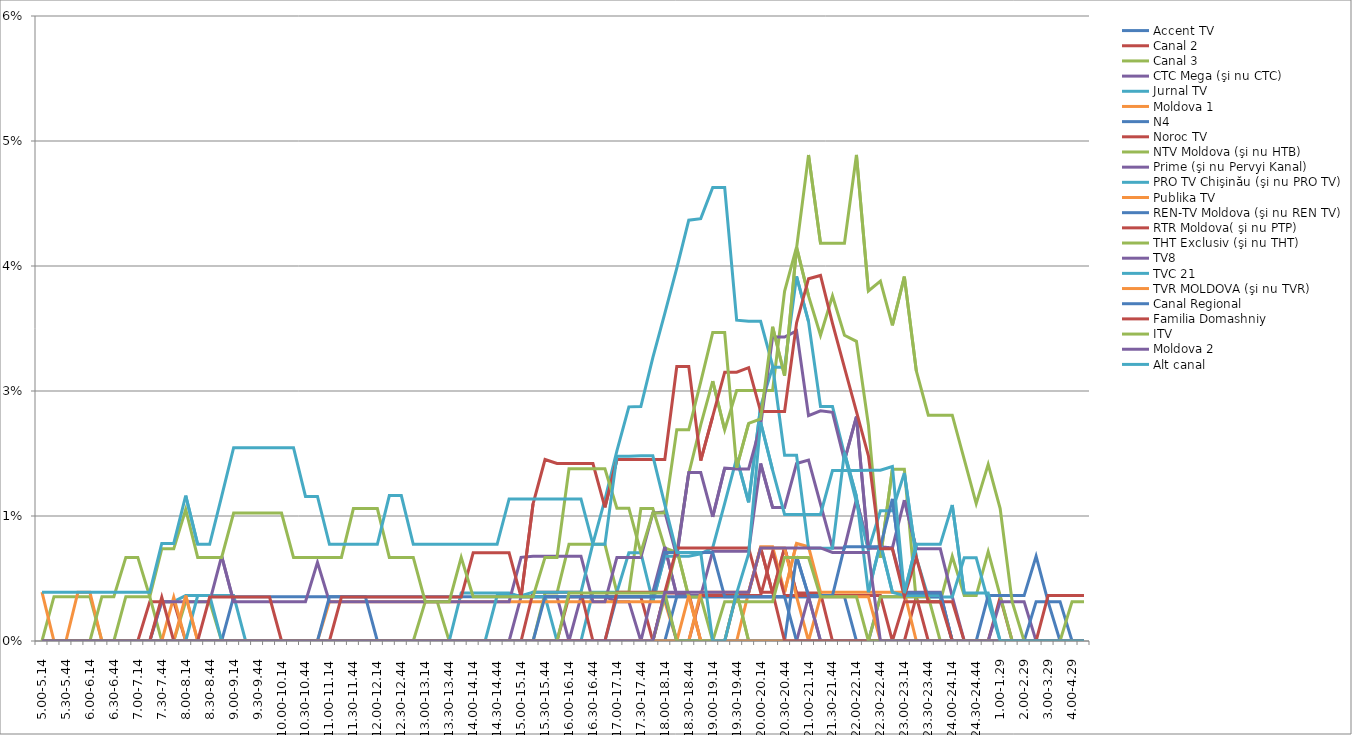
| Category | Accent TV | Canal 2 | Canal 3 | CTC Mega (şi nu CTC) | Jurnal TV | Moldova 1 | N4 | Noroc TV | NTV Moldova (şi nu HTB) | Prime (şi nu Pervyi Kanal) | PRO TV Chişinău (şi nu PRO TV) | Publika TV  | REN-TV Moldova (şi nu REN TV)  | RTR Moldova( şi nu PTP)  | THT Exclusiv (şi nu THT) | TV8 | TVC 21 | TVR MOLDOVA (şi nu TVR) | Canal Regional | Familia Domashniy | ITV | Moldova 2 | Alt canal |
|---|---|---|---|---|---|---|---|---|---|---|---|---|---|---|---|---|---|---|---|---|---|---|---|
| 5.00-5.14 | 0 | 0 | 0 | 0 | 0 | 0 | 0 | 0 | 0 | 0 | 0 | 0.005 | 0 | 0 | 0 | 0 | 0 | 0 | 0 | 0 | 0 | 0 | 0.005 |
| 5.15-5.29 | 0 | 0 | 0.004 | 0 | 0 | 0 | 0 | 0 | 0 | 0 | 0 | 0 | 0 | 0 | 0 | 0 | 0 | 0 | 0 | 0 | 0 | 0 | 0.005 |
| 5.30-5.44 | 0 | 0 | 0.004 | 0 | 0 | 0 | 0 | 0 | 0 | 0 | 0 | 0 | 0 | 0 | 0 | 0 | 0 | 0 | 0 | 0 | 0 | 0 | 0.005 |
| 5.45-5.59 | 0 | 0 | 0.004 | 0 | 0 | 0 | 0 | 0 | 0 | 0 | 0 | 0.005 | 0 | 0 | 0 | 0 | 0 | 0 | 0 | 0 | 0 | 0 | 0.005 |
| 6.00-6.14 | 0 | 0 | 0.004 | 0 | 0 | 0 | 0 | 0 | 0 | 0 | 0 | 0.005 | 0 | 0 | 0 | 0 | 0 | 0 | 0 | 0 | 0 | 0 | 0.005 |
| 6.15-6.29 | 0 | 0 | 0 | 0 | 0 | 0 | 0 | 0 | 0 | 0 | 0 | 0 | 0 | 0 | 0.004 | 0 | 0 | 0 | 0 | 0 | 0 | 0 | 0.005 |
| 6.30-6.44 | 0 | 0 | 0 | 0 | 0 | 0 | 0 | 0 | 0 | 0 | 0 | 0 | 0 | 0 | 0.004 | 0 | 0 | 0 | 0 | 0 | 0 | 0 | 0.005 |
| 6.45-6.59 | 0 | 0 | 0.004 | 0 | 0 | 0 | 0 | 0 | 0 | 0 | 0 | 0 | 0 | 0 | 0.008 | 0 | 0 | 0 | 0 | 0 | 0 | 0 | 0.005 |
| 7.00-7.14 | 0 | 0 | 0.004 | 0 | 0 | 0 | 0 | 0 | 0 | 0 | 0 | 0 | 0 | 0 | 0.008 | 0 | 0 | 0 | 0 | 0 | 0 | 0 | 0.005 |
| 7.15-7.29 | 0 | 0.004 | 0.004 | 0 | 0 | 0 | 0 | 0 | 0 | 0 | 0 | 0 | 0 | 0 | 0.004 | 0 | 0 | 0 | 0 | 0 | 0 | 0 | 0.005 |
| 7.30-7.44 | 0 | 0.004 | 0 | 0 | 0.004 | 0 | 0 | 0 | 0 | 0.004 | 0 | 0 | 0 | 0.004 | 0.009 | 0 | 0 | 0 | 0 | 0 | 0 | 0 | 0.01 |
| 7.45-7.59 | 0 | 0.004 | 0 | 0 | 0.004 | 0.004 | 0 | 0 | 0 | 0.004 | 0 | 0 | 0 | 0 | 0.009 | 0 | 0 | 0 | 0 | 0 | 0 | 0 | 0.01 |
| 8.00-8.14 | 0 | 0 | 0.004 | 0 | 0.005 | 0 | 0 | 0 | 0 | 0.004 | 0 | 0.005 | 0 | 0 | 0.013 | 0 | 0 | 0 | 0 | 0 | 0 | 0 | 0.015 |
| 8.15-8.29 | 0 | 0 | 0.004 | 0 | 0.005 | 0 | 0 | 0 | 0 | 0.004 | 0.005 | 0 | 0 | 0 | 0.008 | 0 | 0 | 0 | 0 | 0 | 0 | 0 | 0.01 |
| 8.30-8.44 | 0 | 0 | 0.004 | 0 | 0.005 | 0 | 0 | 0 | 0 | 0.004 | 0.005 | 0 | 0 | 0.004 | 0.008 | 0 | 0 | 0 | 0 | 0 | 0 | 0 | 0.01 |
| 8.45-8.59 | 0 | 0 | 0 | 0 | 0.005 | 0 | 0 | 0 | 0 | 0.008 | 0 | 0 | 0 | 0.004 | 0.008 | 0 | 0 | 0 | 0 | 0 | 0 | 0 | 0.014 |
| 9.00-9.14 | 0.004 | 0 | 0 | 0 | 0.005 | 0 | 0 | 0 | 0 | 0.004 | 0 | 0 | 0 | 0.004 | 0.013 | 0 | 0 | 0 | 0 | 0 | 0 | 0 | 0.019 |
| 9.15-9.29 | 0.004 | 0 | 0 | 0 | 0 | 0 | 0 | 0 | 0 | 0.004 | 0 | 0 | 0 | 0.004 | 0.013 | 0 | 0 | 0 | 0 | 0 | 0 | 0 | 0.019 |
| 9.30-9.44 | 0.004 | 0 | 0 | 0 | 0 | 0 | 0 | 0 | 0 | 0.004 | 0 | 0 | 0 | 0.004 | 0.013 | 0 | 0 | 0 | 0 | 0 | 0 | 0 | 0.019 |
| 9.45-9.59 | 0.004 | 0 | 0 | 0 | 0 | 0 | 0 | 0 | 0 | 0.004 | 0 | 0 | 0 | 0.004 | 0.013 | 0 | 0 | 0 | 0 | 0 | 0 | 0 | 0.019 |
| 10.00-10.14 | 0.004 | 0 | 0 | 0 | 0 | 0 | 0 | 0 | 0 | 0.004 | 0 | 0 | 0 | 0 | 0.013 | 0 | 0 | 0 | 0 | 0 | 0 | 0 | 0.019 |
| 10.15-10.29 | 0.004 | 0 | 0 | 0 | 0 | 0 | 0 | 0 | 0 | 0.004 | 0 | 0 | 0 | 0 | 0.008 | 0 | 0 | 0 | 0 | 0 | 0 | 0 | 0.019 |
| 10.30-10.44 | 0.004 | 0 | 0 | 0 | 0 | 0 | 0 | 0 | 0 | 0.004 | 0 | 0 | 0 | 0 | 0.008 | 0 | 0 | 0 | 0 | 0 | 0 | 0 | 0.014 |
| 10.45-10.59 | 0.004 | 0 | 0 | 0 | 0 | 0 | 0 | 0 | 0 | 0.008 | 0 | 0 | 0 | 0 | 0.008 | 0 | 0 | 0 | 0 | 0 | 0 | 0 | 0.014 |
| 11.00-11.14 | 0.004 | 0 | 0 | 0 | 0 | 0.004 | 0 | 0 | 0 | 0.004 | 0 | 0 | 0.004 | 0 | 0.008 | 0 | 0 | 0 | 0 | 0 | 0 | 0 | 0.01 |
| 11.15-11.29 | 0.004 | 0 | 0 | 0 | 0 | 0.004 | 0 | 0 | 0 | 0.004 | 0 | 0 | 0.004 | 0.004 | 0.008 | 0 | 0 | 0 | 0 | 0 | 0 | 0 | 0.01 |
| 11.30-11.44 | 0.004 | 0 | 0 | 0 | 0 | 0.004 | 0 | 0 | 0 | 0.004 | 0 | 0 | 0.004 | 0.004 | 0.013 | 0 | 0 | 0 | 0 | 0 | 0 | 0 | 0.01 |
| 11.45-11.59 | 0.004 | 0 | 0 | 0 | 0 | 0.004 | 0 | 0 | 0 | 0.004 | 0 | 0 | 0.004 | 0.004 | 0.013 | 0 | 0 | 0 | 0 | 0 | 0 | 0 | 0.01 |
| 12.00-12.14 | 0.004 | 0 | 0 | 0 | 0 | 0.004 | 0 | 0 | 0 | 0.004 | 0 | 0 | 0 | 0.004 | 0.013 | 0 | 0 | 0 | 0 | 0 | 0 | 0 | 0.01 |
| 12.15-12.29 | 0.004 | 0 | 0 | 0 | 0 | 0.004 | 0 | 0 | 0 | 0.004 | 0 | 0 | 0 | 0.004 | 0.008 | 0 | 0 | 0 | 0 | 0 | 0 | 0 | 0.015 |
| 12.30-12.44 | 0.004 | 0 | 0 | 0 | 0 | 0.004 | 0 | 0 | 0 | 0.004 | 0 | 0 | 0 | 0.004 | 0.008 | 0 | 0 | 0 | 0 | 0 | 0 | 0 | 0.015 |
| 12.45-12.59 | 0.004 | 0 | 0 | 0 | 0 | 0.004 | 0 | 0 | 0 | 0.004 | 0 | 0 | 0 | 0.004 | 0.008 | 0 | 0 | 0 | 0 | 0 | 0 | 0 | 0.01 |
| 13.00-13.14 | 0.004 | 0 | 0.004 | 0 | 0 | 0.004 | 0 | 0 | 0 | 0.004 | 0 | 0 | 0 | 0.004 | 0.004 | 0 | 0 | 0 | 0 | 0 | 0 | 0 | 0.01 |
| 13.15-13.29 | 0.004 | 0 | 0.004 | 0 | 0 | 0.004 | 0 | 0 | 0 | 0.004 | 0 | 0 | 0 | 0.004 | 0.004 | 0 | 0 | 0 | 0 | 0 | 0 | 0 | 0.01 |
| 13.30-13.44 | 0.004 | 0 | 0 | 0 | 0 | 0.004 | 0 | 0 | 0 | 0.004 | 0 | 0 | 0 | 0.004 | 0.004 | 0 | 0 | 0 | 0 | 0 | 0 | 0 | 0.01 |
| 13.45-13.59 | 0.004 | 0 | 0 | 0 | 0.005 | 0.004 | 0 | 0 | 0 | 0.004 | 0 | 0 | 0 | 0.004 | 0.008 | 0 | 0 | 0 | 0 | 0 | 0 | 0 | 0.01 |
| 14.00-14.14 | 0.004 | 0 | 0 | 0 | 0.005 | 0.004 | 0 | 0 | 0 | 0.004 | 0 | 0 | 0 | 0.009 | 0.004 | 0 | 0 | 0 | 0 | 0 | 0 | 0 | 0.01 |
| 14.15-14.29 | 0.004 | 0 | 0 | 0 | 0.005 | 0.004 | 0 | 0 | 0 | 0.004 | 0 | 0 | 0 | 0.009 | 0.004 | 0 | 0 | 0 | 0 | 0 | 0 | 0 | 0.01 |
| 14.30-14.44 | 0.004 | 0 | 0 | 0 | 0.005 | 0.004 | 0 | 0 | 0 | 0.004 | 0.005 | 0 | 0 | 0.009 | 0.004 | 0 | 0 | 0 | 0 | 0 | 0 | 0 | 0.01 |
| 14.45-14.59 | 0.004 | 0 | 0 | 0 | 0.005 | 0.004 | 0 | 0 | 0 | 0.004 | 0.005 | 0 | 0 | 0.009 | 0.004 | 0 | 0 | 0 | 0 | 0 | 0 | 0 | 0.014 |
| 15.00-15.14 | 0.004 | 0 | 0 | 0.004 | 0.004 | 0.004 | 0 | 0 | 0 | 0.008 | 0.005 | 0 | 0 | 0.004 | 0.004 | 0 | 0 | 0 | 0 | 0 | 0 | 0 | 0.014 |
| 15.15-15.29 | 0.004 | 0 | 0 | 0.004 | 0.004 | 0.004 | 0 | 0.005 | 0 | 0.008 | 0.005 | 0 | 0 | 0.014 | 0.004 | 0 | 0 | 0 | 0 | 0 | 0 | 0 | 0.014 |
| 15.30-15.44 | 0.004 | 0 | 0.005 | 0.004 | 0.004 | 0.004 | 0 | 0.005 | 0 | 0.008 | 0.005 | 0 | 0 | 0.018 | 0.008 | 0 | 0 | 0 | 0.004 | 0 | 0 | 0 | 0.014 |
| 15.45-15.59 | 0.004 | 0 | 0.005 | 0.004 | 0 | 0.004 | 0 | 0.005 | 0 | 0.008 | 0.005 | 0 | 0 | 0.018 | 0.008 | 0 | 0 | 0 | 0.004 | 0 | 0 | 0 | 0.014 |
| 16.00-16.14 | 0.004 | 0.004 | 0.01 | 0 | 0 | 0.004 | 0 | 0.005 | 0 | 0.008 | 0.005 | 0 | 0 | 0.018 | 0.017 | 0 | 0 | 0 | 0.004 | 0 | 0.005 | 0 | 0.014 |
| 16.15-16.29 | 0.004 | 0.004 | 0.01 | 0.004 | 0 | 0.004 | 0 | 0.005 | 0 | 0.008 | 0.005 | 0 | 0 | 0.018 | 0.017 | 0 | 0 | 0 | 0.004 | 0 | 0.005 | 0 | 0.014 |
| 16.30-16.44 | 0.004 | 0.004 | 0.01 | 0.004 | 0.005 | 0.004 | 0 | 0 | 0 | 0.004 | 0.01 | 0 | 0 | 0.018 | 0.017 | 0 | 0 | 0 | 0.004 | 0 | 0.005 | 0 | 0.01 |
| 16.45-16.59 | 0.004 | 0.004 | 0.01 | 0.004 | 0.005 | 0.004 | 0 | 0 | 0 | 0.004 | 0.014 | 0 | 0 | 0.013 | 0.017 | 0 | 0 | 0 | 0.004 | 0 | 0.005 | 0 | 0.01 |
| 17.00-17.14 | 0.004 | 0.004 | 0.005 | 0.004 | 0.005 | 0.004 | 0 | 0 | 0 | 0.008 | 0.019 | 0 | 0.004 | 0.018 | 0.013 | 0 | 0 | 0 | 0.004 | 0.005 | 0.005 | 0 | 0.018 |
| 17.15-17.29 | 0.004 | 0.004 | 0.005 | 0.004 | 0.009 | 0.004 | 0 | 0 | 0 | 0.008 | 0.023 | 0 | 0.004 | 0.018 | 0.013 | 0 | 0 | 0 | 0.004 | 0.005 | 0.005 | 0 | 0.018 |
| 17.30-17.44 | 0.004 | 0.004 | 0.013 | 0 | 0.009 | 0.004 | 0 | 0 | 0 | 0.008 | 0.023 | 0 | 0.004 | 0.018 | 0.009 | 0 | 0 | 0 | 0.004 | 0.005 | 0.005 | 0 | 0.019 |
| 17.45-17.59 | 0.004 | 0 | 0.013 | 0.005 | 0.004 | 0.004 | 0 | 0 | 0 | 0.013 | 0.028 | 0 | 0.004 | 0.018 | 0.013 | 0 | 0 | 0 | 0.004 | 0.005 | 0.005 | 0 | 0.019 |
| 18.00-18.14 | 0.004 | 0.005 | 0.009 | 0.009 | 0.008 | 0.004 | 0 | 0 | 0.004 | 0.013 | 0.033 | 0 | 0.004 | 0.018 | 0.013 | 0 | 0 | 0 | 0.009 | 0.005 | 0.005 | 0.005 | 0.014 |
| 18.15-18.29 | 0.004 | 0.005 | 0.009 | 0.005 | 0.008 | 0 | 0.004 | 0 | 0.009 | 0.008 | 0.037 | 0 | 0 | 0.027 | 0.021 | 0 | 0 | 0 | 0.009 | 0.009 | 0 | 0.005 | 0.009 |
| 18.30-18.44 | 0.004 | 0.005 | 0.017 | 0.005 | 0.008 | 0 | 0.004 | 0 | 0.004 | 0.017 | 0.042 | 0 | 0 | 0.027 | 0.021 | 0 | 0 | 0.005 | 0.009 | 0.009 | 0 | 0.005 | 0.009 |
| 18.45-18.59 | 0.004 | 0 | 0.022 | 0.005 | 0.009 | 0 | 0.004 | 0.005 | 0.004 | 0.017 | 0.042 | 0.005 | 0 | 0.018 | 0.026 | 0 | 0 | 0 | 0.009 | 0.009 | 0 | 0.005 | 0.009 |
| 19.00-19.14 | 0.004 | 0 | 0.026 | 0.009 | 0.009 | 0 | 0.004 | 0.005 | 0 | 0.012 | 0.045 | 0.005 | 0 | 0.022 | 0.031 | 0 | 0 | 0 | 0.009 | 0.009 | 0 | 0.005 | 0 |
| 19.15-19.29 | 0.004 | 0 | 0.021 | 0.009 | 0.014 | 0 | 0.004 | 0.005 | 0 | 0.017 | 0.045 | 0.005 | 0 | 0.027 | 0.031 | 0 | 0 | 0 | 0.004 | 0.009 | 0.004 | 0.005 | 0 |
| 19.30-19.44 | 0.004 | 0.005 | 0.025 | 0.009 | 0.018 | 0 | 0.004 | 0.005 | 0.005 | 0.017 | 0.032 | 0.005 | 0 | 0.027 | 0.017 | 0 | 0 | 0 | 0.004 | 0.009 | 0.004 | 0.005 | 0.005 |
| 19.45-19.59 | 0.004 | 0.005 | 0.025 | 0.009 | 0.014 | 0.005 | 0.004 | 0.005 | 0 | 0.017 | 0.032 | 0.005 | 0 | 0.027 | 0.022 | 0 | 0 | 0 | 0.004 | 0.009 | 0.004 | 0.005 | 0.009 |
| 20.00-20.14 | 0.004 | 0.009 | 0.025 | 0.018 | 0.023 | 0.009 | 0.004 | 0.005 | 0 | 0.022 | 0.032 | 0.009 | 0 | 0.023 | 0.022 | 0 | 0 | 0 | 0.004 | 0.005 | 0.004 | 0.009 | 0.022 |
| 20.15-20.29 | 0.004 | 0.005 | 0.025 | 0.013 | 0.027 | 0.009 | 0.004 | 0.009 | 0 | 0.03 | 0.028 | 0.009 | 0 | 0.023 | 0.031 | 0 | 0 | 0 | 0.004 | 0.005 | 0.004 | 0.009 | 0.017 |
| 20.30-20.44 | 0.004 | 0.009 | 0.035 | 0.013 | 0.027 | 0.005 | 0.004 | 0.005 | 0 | 0.03 | 0.019 | 0.009 | 0 | 0.023 | 0.027 | 0 | 0 | 0 | 0.004 | 0 | 0.008 | 0.009 | 0.013 |
| 20.45-20.59 | 0.004 | 0.005 | 0.039 | 0.018 | 0.036 | 0.01 | 0.004 | 0.005 | 0 | 0.031 | 0.019 | 0.004 | 0.008 | 0.032 | 0.039 | 0 | 0 | 0 | 0 | 0 | 0.008 | 0.009 | 0.013 |
| 21.00-21.14 | 0.004 | 0.005 | 0.035 | 0.018 | 0.032 | 0.009 | 0.004 | 0.005 | 0 | 0.023 | 0.009 | 0 | 0.005 | 0.036 | 0.049 | 0.004 | 0 | 0 | 0 | 0 | 0.008 | 0.009 | 0.013 |
| 21.15-21.29 | 0 | 0.005 | 0.031 | 0.014 | 0.023 | 0.005 | 0.004 | 0.005 | 0 | 0.023 | 0.009 | 0.004 | 0.005 | 0.037 | 0.04 | 0 | 0 | 0 | 0 | 0 | 0.004 | 0.009 | 0.013 |
| 21.30-21.44 | 0 | 0 | 0.035 | 0.009 | 0.023 | 0.005 | 0.004 | 0.005 | 0 | 0.023 | 0.009 | 0.004 | 0.005 | 0.032 | 0.04 | 0 | 0 | 0 | 0 | 0 | 0.004 | 0.009 | 0.017 |
| 21.45-21.59 | 0 | 0 | 0.031 | 0.009 | 0.019 | 0.005 | 0.004 | 0.005 | 0 | 0.018 | 0.019 | 0.004 | 0.009 | 0.027 | 0.04 | 0 | 0 | 0 | 0 | 0 | 0.004 | 0.009 | 0.017 |
| 22.00-22.14 | 0 | 0 | 0.03 | 0.014 | 0.014 | 0.005 | 0 | 0.005 | 0 | 0.022 | 0.014 | 0.004 | 0.009 | 0.023 | 0.049 | 0 | 0 | 0 | 0 | 0 | 0.004 | 0.009 | 0.017 |
| 22.15-22.29 | 0 | 0 | 0.022 | 0.009 | 0.009 | 0.005 | 0 | 0.005 | 0 | 0.009 | 0.005 | 0.004 | 0.009 | 0.019 | 0.035 | 0 | 0 | 0 | 0 | 0 | 0 | 0.009 | 0.017 |
| 22.30-22.44 | 0 | 0 | 0.008 | 0.009 | 0.013 | 0.005 | 0.004 | 0.005 | 0.004 | 0.009 | 0.01 | 0 | 0.009 | 0.009 | 0.036 | 0 | 0 | 0 | 0 | 0 | 0 | 0 | 0.017 |
| 22.45-22.59 | 0 | 0 | 0.017 | 0.009 | 0.013 | 0.005 | 0.004 | 0 | 0.004 | 0.009 | 0.005 | 0 | 0.014 | 0.009 | 0.032 | 0 | 0 | 0 | 0 | 0 | 0 | 0 | 0.017 |
| 23.00-23.14 | 0 | 0 | 0.017 | 0.014 | 0.017 | 0.005 | 0.004 | 0.004 | 0.004 | 0.005 | 0.005 | 0 | 0.005 | 0.004 | 0.036 | 0 | 0 | 0 | 0 | 0 | 0 | 0 | 0.005 |
| 23.15-23.29 | 0 | 0.004 | 0.004 | 0.009 | 0.008 | 0 | 0.004 | 0.004 | 0.004 | 0.005 | 0.005 | 0 | 0.005 | 0.008 | 0.027 | 0 | 0 | 0 | 0 | 0 | 0 | 0 | 0.01 |
| 23.30-23.44 | 0 | 0 | 0.004 | 0.009 | 0.004 | 0 | 0.004 | 0.004 | 0.004 | 0.005 | 0.005 | 0 | 0.005 | 0.004 | 0.023 | 0 | 0 | 0 | 0 | 0 | 0 | 0 | 0.01 |
| 23.45-23.59 | 0 | 0 | 0.004 | 0.009 | 0.004 | 0 | 0.004 | 0.004 | 0 | 0.005 | 0.005 | 0 | 0.005 | 0.004 | 0.023 | 0 | 0 | 0 | 0 | 0 | 0 | 0 | 0.01 |
| 24.00-24.14 | 0 | 0 | 0.008 | 0.004 | 0.004 | 0 | 0 | 0.004 | 0 | 0 | 0 | 0 | 0 | 0 | 0.023 | 0 | 0 | 0 | 0 | 0 | 0 | 0 | 0.014 |
| 24.15-24.29 | 0 | 0 | 0.005 | 0 | 0.008 | 0 | 0 | 0 | 0 | 0 | 0 | 0 | 0 | 0 | 0.018 | 0 | 0 | 0 | 0 | 0 | 0 | 0 | 0.005 |
| 24.30-24.44 | 0 | 0 | 0.005 | 0 | 0.008 | 0 | 0 | 0 | 0 | 0 | 0 | 0 | 0 | 0 | 0.014 | 0 | 0 | 0 | 0 | 0 | 0 | 0 | 0.005 |
| 24.45-24.59 | 0 | 0 | 0.009 | 0 | 0.004 | 0 | 0 | 0 | 0 | 0 | 0 | 0 | 0.005 | 0 | 0.018 | 0 | 0 | 0 | 0 | 0 | 0 | 0 | 0.005 |
| 1.00-1.29 | 0 | 0.004 | 0.005 | 0.004 | 0 | 0 | 0 | 0 | 0 | 0 | 0 | 0 | 0.005 | 0 | 0.013 | 0 | 0 | 0 | 0 | 0 | 0 | 0 | 0 |
| 1.30-1. 59 | 0 | 0 | 0 | 0.004 | 0 | 0 | 0 | 0 | 0 | 0 | 0 | 0 | 0.005 | 0 | 0.004 | 0 | 0 | 0 | 0 | 0 | 0 | 0 | 0 |
| 2.00-2.29 | 0 | 0 | 0 | 0.004 | 0 | 0 | 0 | 0 | 0 | 0 | 0 | 0 | 0.005 | 0 | 0 | 0 | 0 | 0 | 0 | 0 | 0 | 0 | 0 |
| 2.30-2.59 | 0 | 0 | 0 | 0 | 0 | 0 | 0.004 | 0 | 0 | 0 | 0 | 0 | 0.008 | 0 | 0 | 0 | 0 | 0 | 0 | 0 | 0 | 0 | 0 |
| 3.00-3.29 | 0 | 0 | 0 | 0 | 0 | 0 | 0.004 | 0 | 0 | 0 | 0 | 0 | 0.004 | 0.005 | 0 | 0 | 0 | 0 | 0 | 0 | 0 | 0 | 0 |
| 3.30-3.59 | 0 | 0 | 0 | 0 | 0 | 0 | 0.004 | 0 | 0 | 0 | 0 | 0 | 0 | 0.005 | 0 | 0 | 0 | 0 | 0 | 0 | 0 | 0 | 0 |
| 4.00-4.29 | 0 | 0 | 0 | 0 | 0 | 0 | 0 | 0 | 0 | 0 | 0 | 0 | 0 | 0.005 | 0.004 | 0 | 0 | 0 | 0 | 0 | 0 | 0 | 0 |
| 4.30-4.59 | 0 | 0 | 0 | 0 | 0 | 0 | 0 | 0 | 0 | 0 | 0 | 0 | 0 | 0.005 | 0.004 | 0 | 0 | 0 | 0 | 0 | 0 | 0 | 0 |